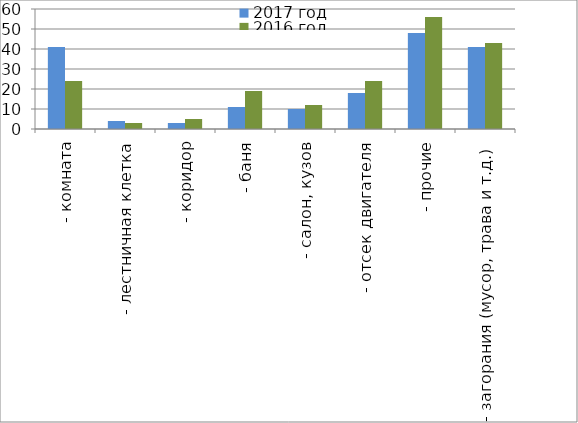
| Category | 2017 год | 2016 год |
|---|---|---|
|  - комната | 41 | 24 |
|  - лестничная клетка | 4 | 3 |
|  - коридор | 3 | 5 |
|  - баня | 11 | 19 |
|  - салон, кузов | 10 | 12 |
|  - отсек двигателя | 18 | 24 |
| - прочие | 48 | 56 |
| - загорания (мусор, трава и т.д.)  | 41 | 43 |